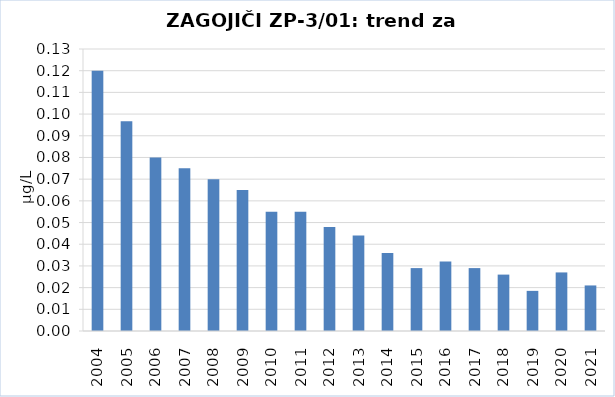
| Category | Vsota |
|---|---|
| 2004 | 0.12 |
| 2005 | 0.097 |
| 2006 | 0.08 |
| 2007 | 0.075 |
| 2008 | 0.07 |
| 2009 | 0.065 |
| 2010 | 0.055 |
| 2011 | 0.055 |
| 2012 | 0.048 |
| 2013 | 0.044 |
| 2014 | 0.036 |
| 2015 | 0.029 |
| 2016 | 0.032 |
| 2017 | 0.029 |
| 2018 | 0.026 |
| 2019 | 0.019 |
| 2020 | 0.027 |
| 2021 | 0.021 |